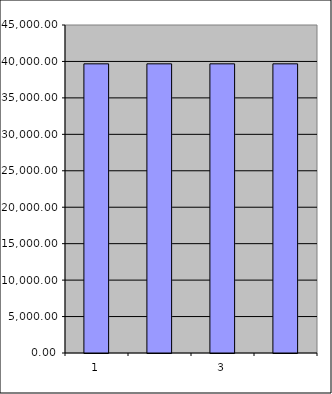
| Category | Series 0 |
|---|---|
| 0 | 39672.5 |
| 1 | 39672.5 |
| 2 | 39672.5 |
| 3 | 39672.5 |